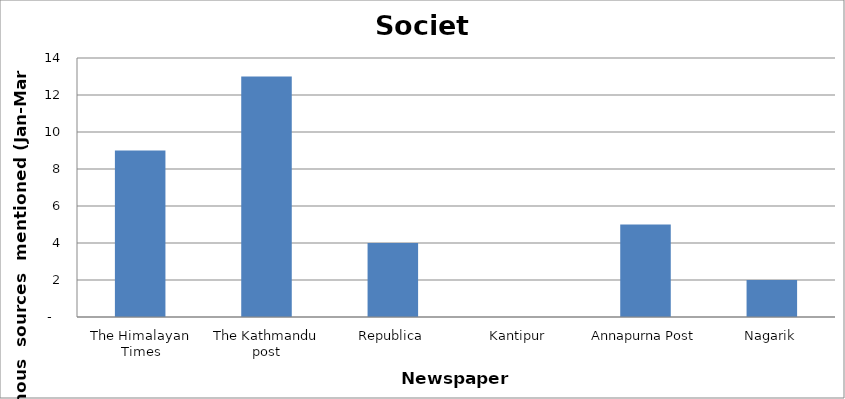
| Category | Society |
|---|---|
| The Himalayan Times | 9 |
| The Kathmandu post | 13 |
| Republica | 4 |
| Kantipur | 0 |
| Annapurna Post | 5 |
| Nagarik | 2 |